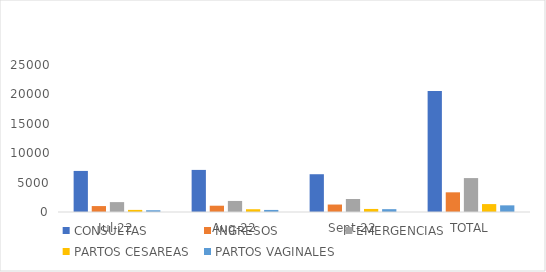
| Category | CONSULTAS | INGRESOS | EMERGENCIAS | PARTOS CESAREAS | PARTOS VAGINALES |
|---|---|---|---|---|---|
| jul-22 | 6985 | 1009 | 1681 | 357 | 298 |
| ago-22 | 7158 | 1069 | 1880 | 470 | 352 |
| sep-22 | 6424 | 1269 | 2208 | 519 | 481 |
| TOTAL | 20567 | 3347 | 5769 | 1346 | 1131 |